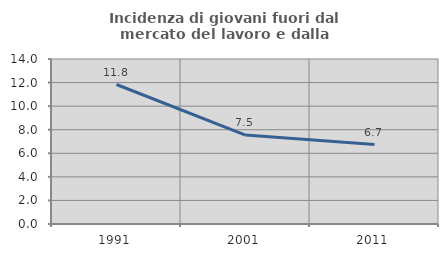
| Category | Incidenza di giovani fuori dal mercato del lavoro e dalla formazione  |
|---|---|
| 1991.0 | 11.836 |
| 2001.0 | 7.542 |
| 2011.0 | 6.742 |